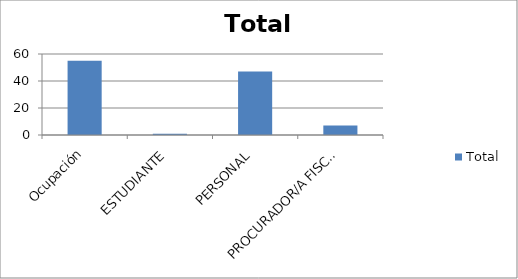
| Category | Total |
|---|---|
| Ocupación | 55 |
| ESTUDIANTE | 1 |
| PERSONAL | 47 |
| PROCURADOR/A FISCAL | 7 |